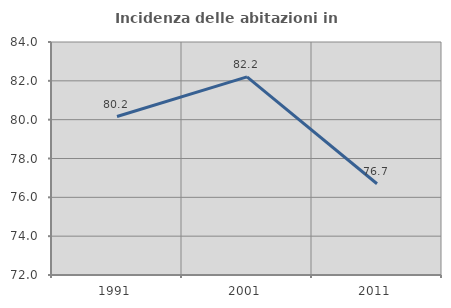
| Category | Incidenza delle abitazioni in proprietà  |
|---|---|
| 1991.0 | 80.162 |
| 2001.0 | 82.201 |
| 2011.0 | 76.7 |